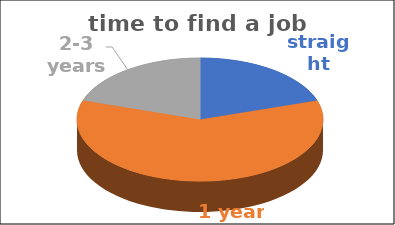
| Category | time to find a job | Series 1 | Series 2 | Series 3 | Series 4 |
|---|---|---|---|---|---|
| straight away | 0.2 |  |  |  |  |
| 1 year | 0.6 |  |  |  |  |
| 2-3 years | 0.2 |  |  |  |  |